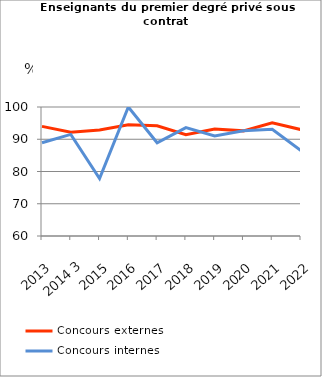
| Category | Concours externes  | Concours internes |
|---|---|---|
| 2013 | 94 | 88.9 |
| 2014 3 | 92.2 | 91.5 |
| 2015 | 92.9 | 77.8 |
| 2016 | 94.5 | 100 |
| 2017 | 94.2 | 88.9 |
| 2018 | 91.4 | 93.6 |
| 2019 | 93.2 | 91 |
| 2020 | 92.6 | 92.6 |
| 2021 | 95.1 | 93.1 |
| 2022 | 93 | 86.5 |